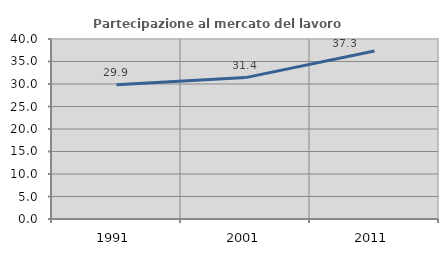
| Category | Partecipazione al mercato del lavoro  femminile |
|---|---|
| 1991.0 | 29.851 |
| 2001.0 | 31.418 |
| 2011.0 | 37.349 |